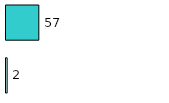
| Category | Series 0 | Series 1 |
|---|---|---|
| 0 | 2 | 57 |